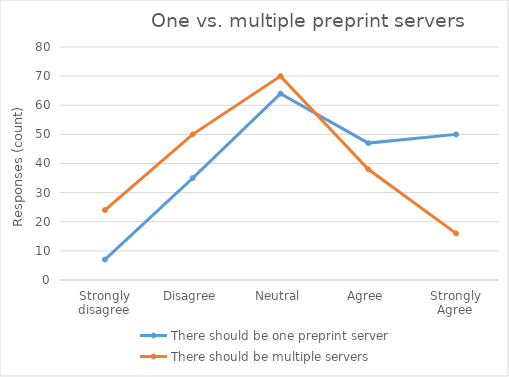
| Category | There should be one preprint server | There should be multiple servers |
|---|---|---|
| Strongly disagree | 7 | 24 |
| Disagree | 35 | 50 |
| Neutral | 64 | 70 |
| Agree | 47 | 38 |
| Strongly Agree | 50 | 16 |